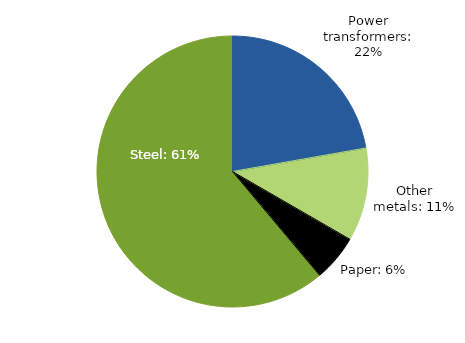
| Category | Series 0 |
|---|---|
| Steel | 61.111 |
| Power transformers | 22.222 |
| Other metals | 11.111 |
| Paper | 5.556 |